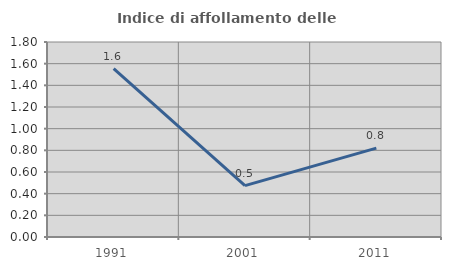
| Category | Indice di affollamento delle abitazioni  |
|---|---|
| 1991.0 | 1.554 |
| 2001.0 | 0.474 |
| 2011.0 | 0.821 |